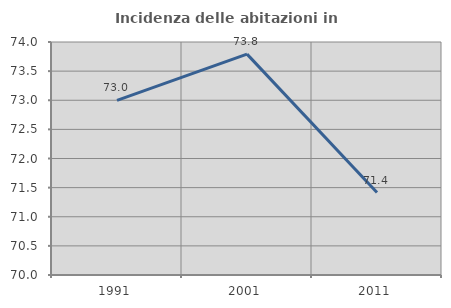
| Category | Incidenza delle abitazioni in proprietà  |
|---|---|
| 1991.0 | 72.998 |
| 2001.0 | 73.792 |
| 2011.0 | 71.415 |